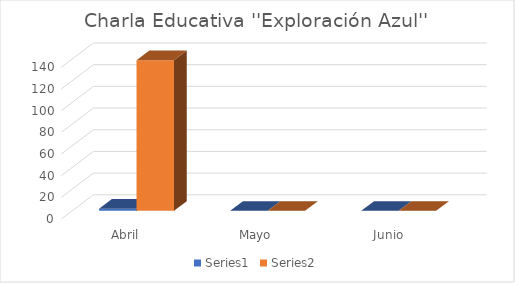
| Category | Series 0 | Series 1 |
|---|---|---|
| Abril | 2 | 139 |
| Mayo | 0 | 0 |
| Junio | 0 | 0 |